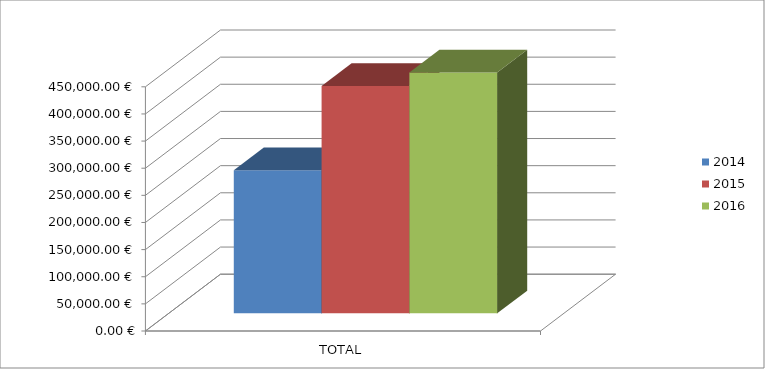
| Category | 2014 | 2015 | 2016 |
|---|---|---|---|
| TOTAL | 263740 | 418907 | 444041 |